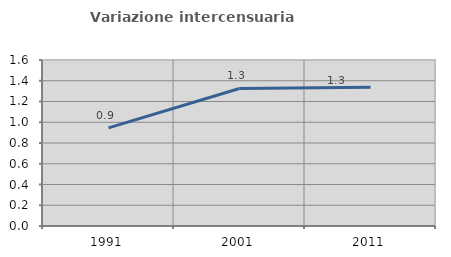
| Category | Variazione intercensuaria annua |
|---|---|
| 1991.0 | 0.946 |
| 2001.0 | 1.326 |
| 2011.0 | 1.337 |